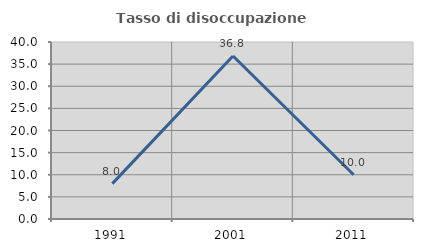
| Category | Tasso di disoccupazione giovanile  |
|---|---|
| 1991.0 | 8 |
| 2001.0 | 36.842 |
| 2011.0 | 10 |